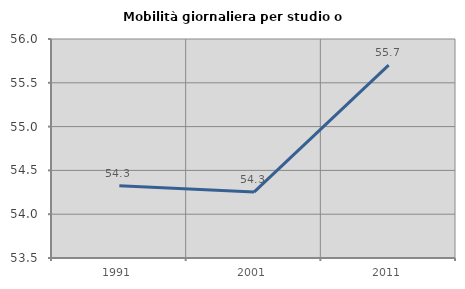
| Category | Mobilità giornaliera per studio o lavoro |
|---|---|
| 1991.0 | 54.324 |
| 2001.0 | 54.252 |
| 2011.0 | 55.702 |